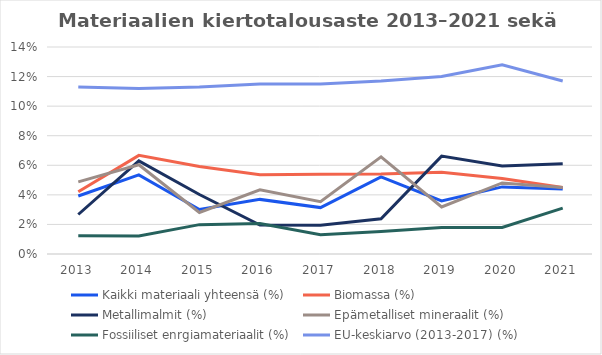
| Category | Kaikki materiaali yhteensä (%) | Biomassa (%) | Metallimalmit (%) | Epämetalliset mineraalit (%) | Fossiiliset enrgiamateriaalit (%) | EU-keskiarvo (2013-2017) (%) |
|---|---|---|---|---|---|---|
| 2013.0 | 0.039 | 0.042 | 0.027 | 0.049 | 0.012 | 0.113 |
| 2014.0 | 0.054 | 0.067 | 0.063 | 0.06 | 0.012 | 0.112 |
| 2015.0 | 0.03 | 0.059 | 0.04 | 0.028 | 0.02 | 0.113 |
| 2016.0 | 0.037 | 0.054 | 0.02 | 0.043 | 0.021 | 0.115 |
| 2017.0 | 0.031 | 0.054 | 0.02 | 0.035 | 0.013 | 0.115 |
| 2018.0 | 0.052 | 0.054 | 0.024 | 0.066 | 0.015 | 0.117 |
| 2019.0 | 0.036 | 0.055 | 0.066 | 0.032 | 0.018 | 0.12 |
| 2020.0 | 0.045 | 0.051 | 0.059 | 0.048 | 0.018 | 0.128 |
| 2021.0 | 0.044 | 0.045 | 0.061 | 0.045 | 0.031 | 0.117 |